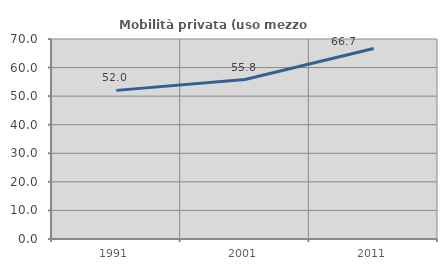
| Category | Mobilità privata (uso mezzo privato) |
|---|---|
| 1991.0 | 52.02 |
| 2001.0 | 55.804 |
| 2011.0 | 66.667 |